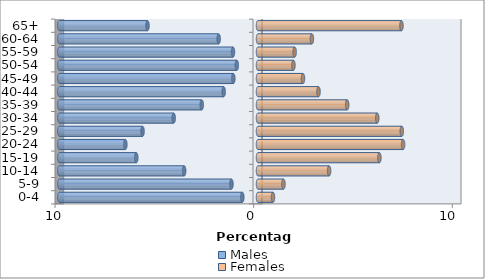
| Category | Males | Females |
|---|---|---|
| 0-4 | -0.789 | 0.755 |
| 5-9 | -1.336 | 1.281 |
| 10-14 | -3.716 | 3.578 |
| 15-19 | -6.127 | 6.111 |
| 20-24 | -6.676 | 7.303 |
| 25-29 | -5.812 | 7.237 |
| 30-34 | -4.243 | 6.002 |
| 35-39 | -2.832 | 4.49 |
| 40-44 | -1.729 | 3.047 |
| 45-49 | -1.241 | 2.264 |
| 50-54 | -1.067 | 1.783 |
| 55-59 | -1.26 | 1.844 |
| 60-64 | -1.98 | 2.713 |
| 65+ | -5.562 | 7.222 |